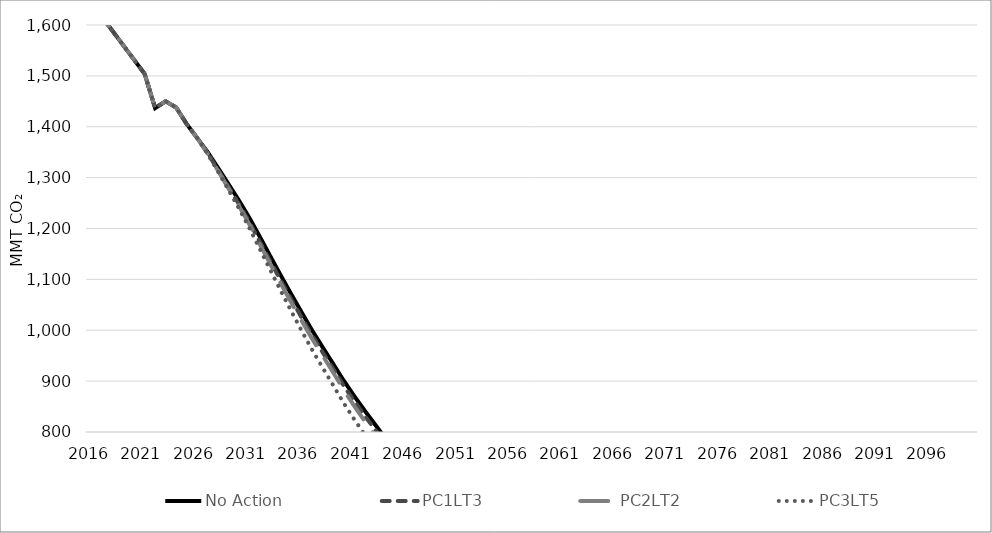
| Category | No Action | PC1LT3 | PC2LT2 | PC3LT5 |
|---|---|---|---|---|
| 2016.0 | 1641.576 | 1641.576 | 1641.576 | 1641.576 |
| 2017.0 | 1614.032 | 1614.032 | 1614.032 | 1614.032 |
| 2018.0 | 1586.488 | 1586.488 | 1586.488 | 1586.488 |
| 2019.0 | 1558.944 | 1558.944 | 1558.944 | 1558.944 |
| 2020.0 | 1531.4 | 1531.4 | 1531.4 | 1531.4 |
| 2021.0 | 1503.856 | 1503.856 | 1503.856 | 1503.856 |
| 2022.0 | 1436.757 | 1436.757 | 1436.757 | 1436.757 |
| 2023.0 | 1450.133 | 1450.133 | 1450.133 | 1450.133 |
| 2024.0 | 1438.015 | 1438.015 | 1438.015 | 1438.015 |
| 2025.0 | 1405.595 | 1405.595 | 1405.595 | 1405.595 |
| 2026.0 | 1378.201 | 1378.201 | 1378.201 | 1378.201 |
| 2027.0 | 1350.345 | 1348.344 | 1347.694 | 1346.87 |
| 2028.0 | 1319.186 | 1315.145 | 1313.64 | 1311.746 |
| 2029.0 | 1287.335 | 1281.248 | 1278.879 | 1275.835 |
| 2030.0 | 1255.016 | 1247.696 | 1244.408 | 1239.313 |
| 2031.0 | 1220.561 | 1211.959 | 1207.811 | 1200.457 |
| 2032.0 | 1183.349 | 1173.446 | 1168.385 | 1159.086 |
| 2033.0 | 1145.247 | 1135.02 | 1129.552 | 1117.77 |
| 2034.0 | 1107.354 | 1097.131 | 1091.231 | 1076.762 |
| 2035.0 | 1070.324 | 1060.13 | 1053.863 | 1036.939 |
| 2036.0 | 1034.398 | 1024.048 | 1017.624 | 998.075 |
| 2037.0 | 999.132 | 988.897 | 982.32 | 960.602 |
| 2038.0 | 965.859 | 955.987 | 949.469 | 925.632 |
| 2039.0 | 933.605 | 923.824 | 916.517 | 891.308 |
| 2040.0 | 900.773 | 890.665 | 882.524 | 856.441 |
| 2041.0 | 870.56 | 860.487 | 851.07 | 824.711 |
| 2042.0 | 841.714 | 831.652 | 821.336 | 794.481 |
| 2043.0 | 814.258 | 804.421 | 793.355 | 766.225 |
| 2044.0 | 786.663 | 776.923 | 764.78 | 737.918 |
| 2045.0 | 757.102 | 748.471 | 735.718 | 709.656 |
| 2046.0 | 726.731 | 719.567 | 706.779 | 680.562 |
| 2047.0 | 697.172 | 691.495 | 678.631 | 652.402 |
| 2048.0 | 668.744 | 664.508 | 651.649 | 625.116 |
| 2049.0 | 638.862 | 635.883 | 623.181 | 596.738 |
| 2050.0 | 608.103 | 606.14 | 593.898 | 567.723 |
| 2051.0 | 607.791 | 605.829 | 593.592 | 567.431 |
| 2052.0 | 607.478 | 605.517 | 593.287 | 567.139 |
| 2053.0 | 607.166 | 605.206 | 592.982 | 566.847 |
| 2054.0 | 606.853 | 604.894 | 592.677 | 566.556 |
| 2055.0 | 606.541 | 604.583 | 592.372 | 566.264 |
| 2056.0 | 606.228 | 604.271 | 592.066 | 565.972 |
| 2057.0 | 605.916 | 603.96 | 591.761 | 565.68 |
| 2058.0 | 605.603 | 603.648 | 591.456 | 565.388 |
| 2059.0 | 605.291 | 603.337 | 591.151 | 565.097 |
| 2060.0 | 604.978 | 603.025 | 590.845 | 564.805 |
| 2061.0 | 604.665 | 602.714 | 590.54 | 564.513 |
| 2062.0 | 604.353 | 602.402 | 590.235 | 564.221 |
| 2063.0 | 604.04 | 602.091 | 589.93 | 563.93 |
| 2064.0 | 603.728 | 601.779 | 589.625 | 563.638 |
| 2065.0 | 603.415 | 601.467 | 589.319 | 563.346 |
| 2066.0 | 603.235 | 601.288 | 589.143 | 563.178 |
| 2067.0 | 603.055 | 601.108 | 588.967 | 563.009 |
| 2068.0 | 602.875 | 600.928 | 588.791 | 562.841 |
| 2069.0 | 602.694 | 600.749 | 588.615 | 562.673 |
| 2070.0 | 602.514 | 600.569 | 588.439 | 562.505 |
| 2071.0 | 602.334 | 600.389 | 588.263 | 562.336 |
| 2072.0 | 602.154 | 600.21 | 588.087 | 562.168 |
| 2073.0 | 601.973 | 600.03 | 587.911 | 562 |
| 2074.0 | 601.793 | 599.85 | 587.735 | 561.831 |
| 2075.0 | 601.613 | 599.671 | 587.559 | 561.663 |
| 2076.0 | 601.432 | 599.491 | 587.383 | 561.495 |
| 2077.0 | 601.252 | 599.311 | 587.207 | 561.326 |
| 2078.0 | 601.072 | 599.132 | 587.031 | 561.158 |
| 2079.0 | 600.892 | 598.952 | 586.855 | 560.99 |
| 2080.0 | 600.711 | 598.772 | 586.679 | 560.822 |
| 2081.0 | 597.912 | 595.982 | 583.944 | 558.208 |
| 2082.0 | 595.112 | 593.191 | 581.21 | 555.594 |
| 2083.0 | 592.312 | 590.4 | 578.476 | 552.98 |
| 2084.0 | 589.513 | 587.61 | 575.741 | 550.367 |
| 2085.0 | 586.713 | 584.819 | 573.007 | 547.753 |
| 2086.0 | 583.913 | 582.028 | 570.273 | 545.139 |
| 2087.0 | 581.114 | 579.238 | 567.539 | 542.525 |
| 2088.0 | 578.314 | 576.447 | 564.804 | 539.911 |
| 2089.0 | 575.514 | 573.656 | 562.07 | 537.298 |
| 2090.0 | 572.715 | 570.866 | 559.336 | 534.684 |
| 2091.0 | 569.915 | 568.075 | 556.601 | 532.07 |
| 2092.0 | 567.115 | 565.285 | 553.867 | 529.456 |
| 2093.0 | 564.316 | 562.494 | 551.133 | 526.843 |
| 2094.0 | 561.516 | 559.703 | 548.399 | 524.229 |
| 2095.0 | 558.716 | 556.913 | 545.664 | 521.615 |
| 2096.0 | 558.716 | 556.913 | 545.664 | 521.615 |
| 2097.0 | 558.716 | 556.913 | 545.664 | 521.615 |
| 2098.0 | 558.716 | 556.913 | 545.664 | 521.615 |
| 2099.0 | 558.716 | 556.913 | 545.664 | 521.615 |
| 2100.0 | 558.716 | 556.913 | 545.664 | 521.615 |